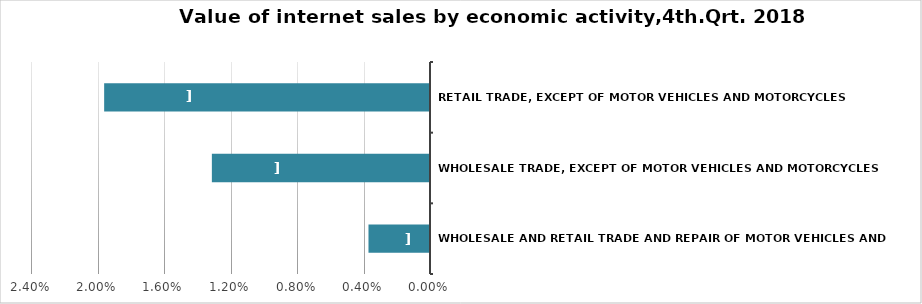
| Category | Series 0 |
|---|---|
| Wholesale and retail trade and repair of motor vehicles and motorcycles | 0.004 |
| Wholesale trade, except of motor vehicles and motorcycles | 0.013 |
| Retail trade, except of motor vehicles and motorcycles | 0.02 |